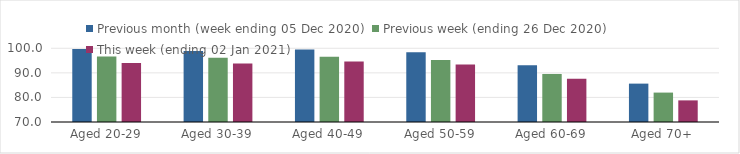
| Category | Previous month (week ending 05 Dec 2020) | Previous week (ending 26 Dec 2020) | This week (ending 02 Jan 2021) |
|---|---|---|---|
| Aged 20-29 | 99.69 | 96.65 | 93.97 |
| Aged 30-39 | 98.9 | 96.16 | 93.83 |
| Aged 40-49 | 99.49 | 96.54 | 94.58 |
| Aged 50-59 | 98.4 | 95.23 | 93.44 |
| Aged 60-69 | 93.12 | 89.55 | 87.65 |
| Aged 70+ | 85.62 | 81.97 | 78.8 |